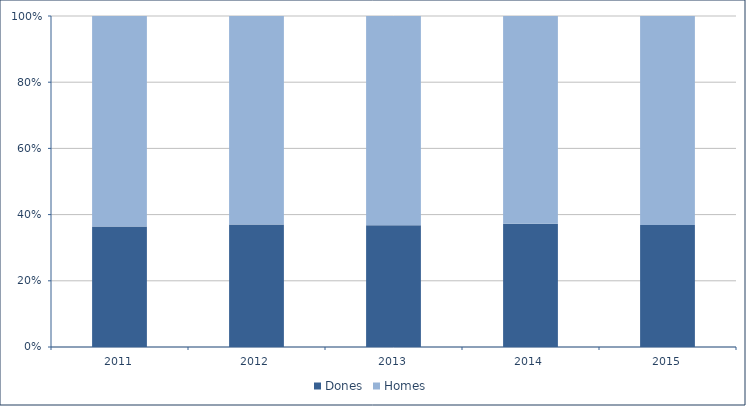
| Category | Dones | Homes |
|---|---|---|
| 2011.0 | 2070 | 3612 |
| 2012.0 | 1999 | 3407 |
| 2013.0 | 1854 | 3185 |
| 2014.0 | 1799 | 3034 |
| 2015.0 | 1787 | 3060 |